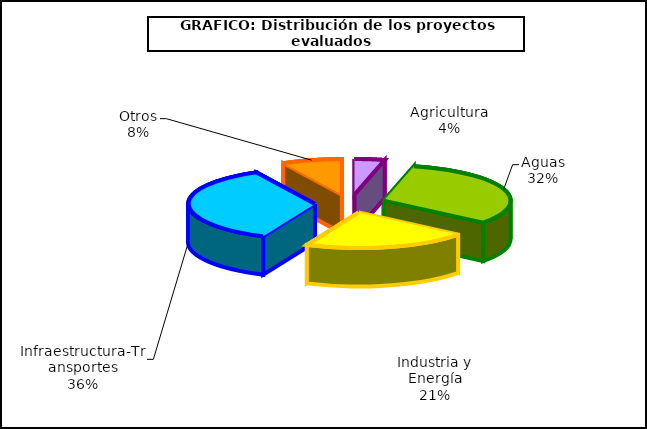
| Category | Series 0 |
|---|---|
| 0 | 6 |
| 1 | 50 |
| 2 | 33 |
| 3 | 56 |
| 4 | 12 |